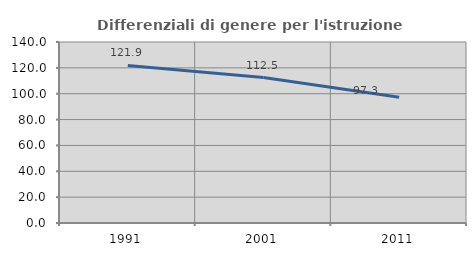
| Category | Differenziali di genere per l'istruzione superiore |
|---|---|
| 1991.0 | 121.853 |
| 2001.0 | 112.465 |
| 2011.0 | 97.287 |